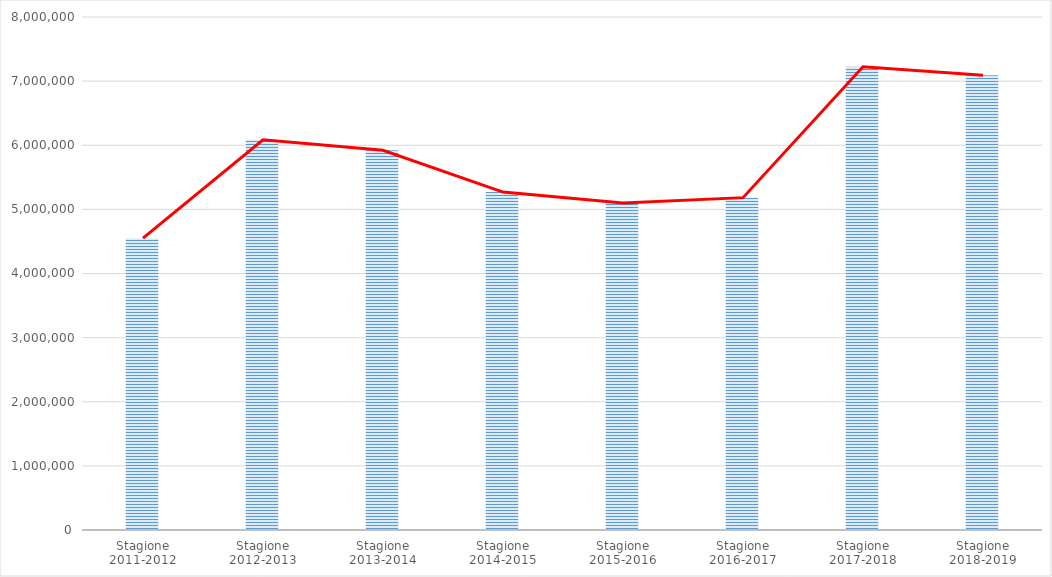
| Category | Series 0 |
|---|---|
| Stagione 2011-2012 | 4551142.5 |
| Stagione 2012-2013 | 6086229.4 |
| Stagione 2013-2014 | 5920431 |
| Stagione 2014-2015 | 5269112.55 |
| Stagione 2015-2016 | 5101104.7 |
| Stagione 2016-2017 | 5182996.9 |
| Stagione 2017-2018 | 7223748.5 |
| Stagione 2018-2019 | 7092229.5 |